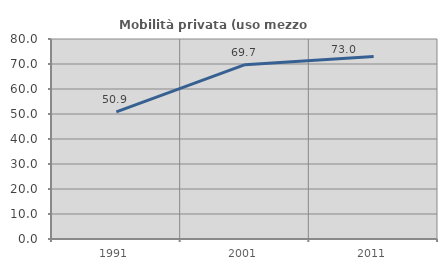
| Category | Mobilità privata (uso mezzo privato) |
|---|---|
| 1991.0 | 50.853 |
| 2001.0 | 69.742 |
| 2011.0 | 72.953 |